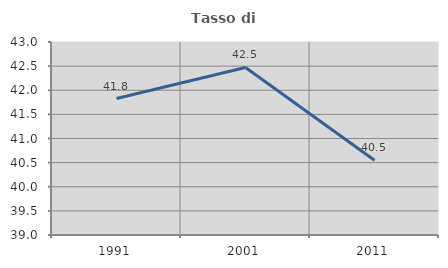
| Category | Tasso di occupazione   |
|---|---|
| 1991.0 | 41.828 |
| 2001.0 | 42.472 |
| 2011.0 | 40.548 |